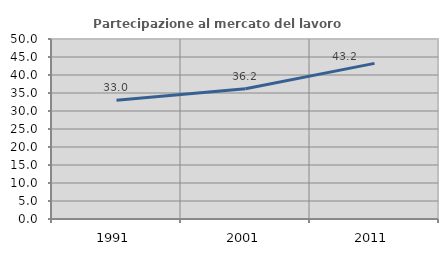
| Category | Partecipazione al mercato del lavoro  femminile |
|---|---|
| 1991.0 | 32.955 |
| 2001.0 | 36.17 |
| 2011.0 | 43.231 |